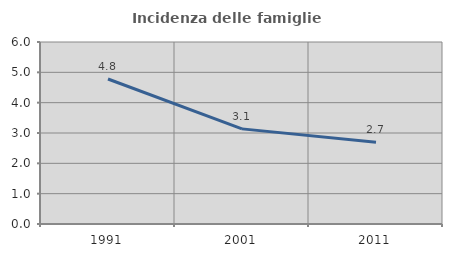
| Category | Incidenza delle famiglie numerose |
|---|---|
| 1991.0 | 4.781 |
| 2001.0 | 3.136 |
| 2011.0 | 2.696 |